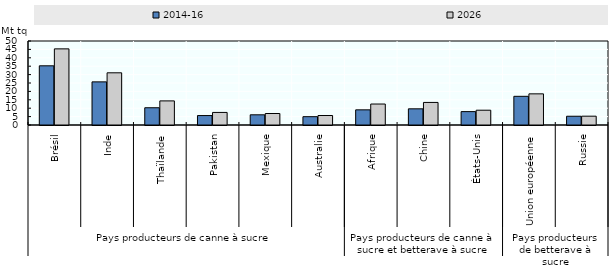
| Category | 2014-16 | 2026 |
|---|---|---|
| 0 | 35.238 | 45.316 |
| 1 | 25.67 | 31.07 |
| 2 | 10.269 | 14.344 |
| 3 | 5.624 | 7.479 |
| 4 | 6.068 | 6.842 |
| 5 | 4.953 | 5.652 |
| 6 | 9.023 | 12.483 |
| 7 | 9.635 | 13.439 |
| 8 | 7.964 | 8.799 |
| 9 | 17.072 | 18.539 |
| 10 | 5.213 | 5.253 |